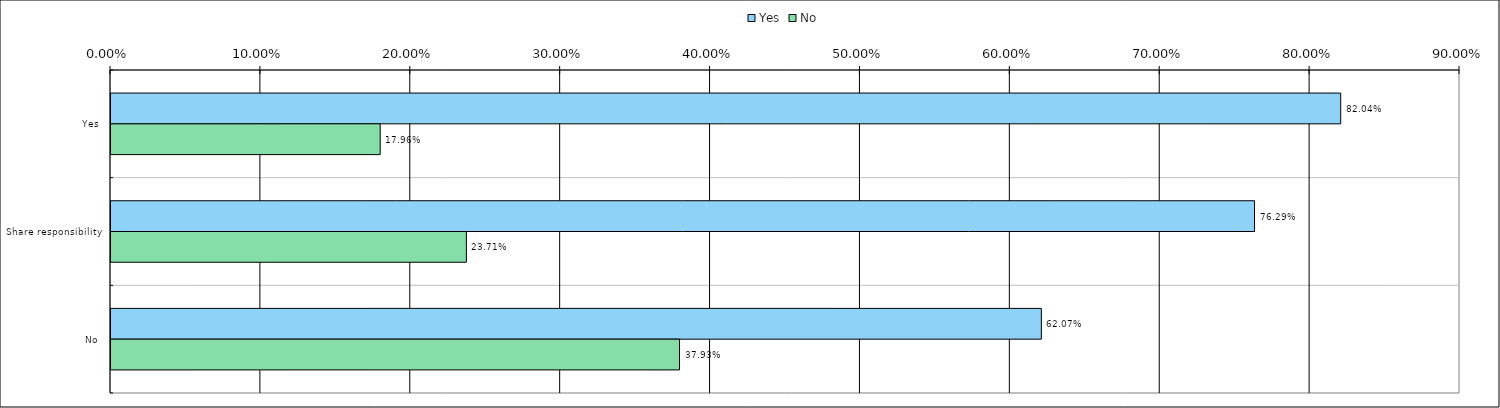
| Category | Yes | No |
|---|---|---|
| 0 | 0.82 | 0.18 |
| 1 | 0.763 | 0.237 |
| 2 | 0.621 | 0.379 |